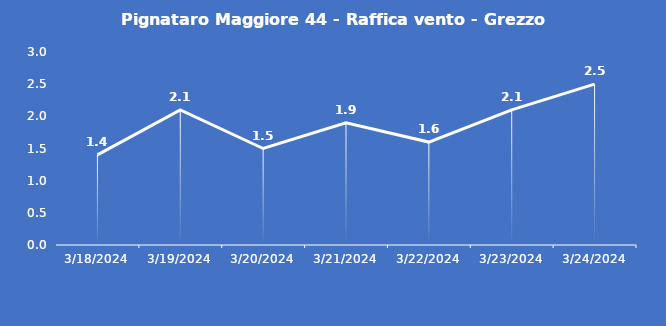
| Category | Pignataro Maggiore 44 - Raffica vento - Grezzo (m/s) |
|---|---|
| 3/18/24 | 1.4 |
| 3/19/24 | 2.1 |
| 3/20/24 | 1.5 |
| 3/21/24 | 1.9 |
| 3/22/24 | 1.6 |
| 3/23/24 | 2.1 |
| 3/24/24 | 2.5 |